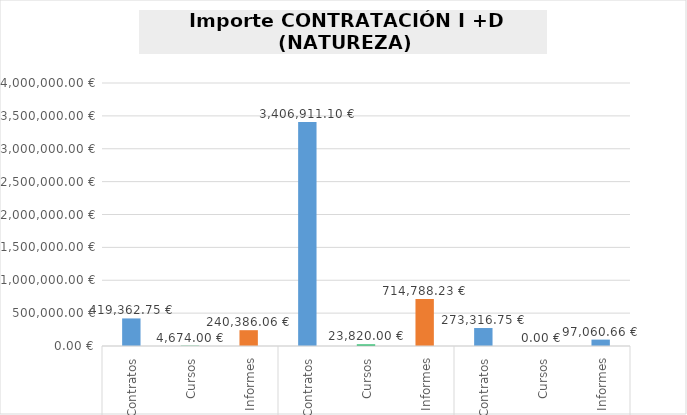
| Category | Series 0 |
|---|---|
| 0 | 419362.75 |
| 1 | 4674 |
| 2 | 240386.06 |
| 3 | 3406911.1 |
| 4 | 23820 |
| 5 | 714788.23 |
| 6 | 273316.75 |
| 7 | 0 |
| 8 | 97060.66 |